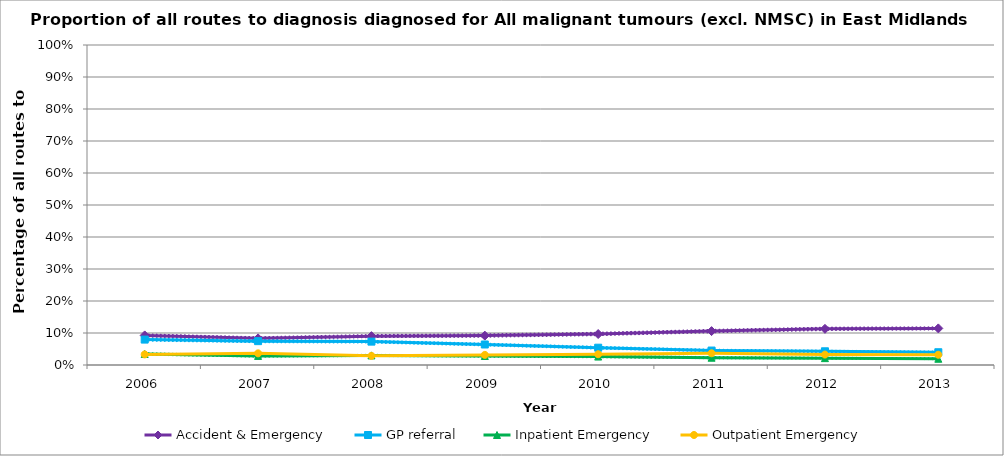
| Category | Accident & Emergency | Series 1 | Series 2 | GP referral | Series 4 | Series 5 | Inpatient Emergency | Series 7 | Series 8 | Outpatient Emergency | Series 10 | Series 11 |
|---|---|---|---|---|---|---|---|---|---|---|---|---|
| 2006.0 | 0.092 | 0.089 | 0.096 | 0.079 | 0.076 | 0.083 | 0.034 | 0.032 | 0.037 | 0.033 |  |  |
| 2007.0 | 0.083 | 0.08 | 0.087 | 0.075 | 0.071 | 0.078 | 0.028 | 0.026 | 0.03 | 0.036 |  |  |
| 2008.0 | 0.09 | 0.087 | 0.094 | 0.073 | 0.07 | 0.076 | 0.03 | 0.028 | 0.032 | 0.029 |  |  |
| 2009.0 | 0.092 | 0.088 | 0.096 | 0.064 | 0.061 | 0.067 | 0.028 | 0.026 | 0.03 | 0.032 |  |  |
| 2010.0 | 0.097 | 0.093 | 0.101 | 0.054 | 0.051 | 0.057 | 0.026 | 0.024 | 0.028 | 0.034 |  |  |
| 2011.0 | 0.106 | 0.102 | 0.11 | 0.045 | 0.043 | 0.048 | 0.023 | 0.021 | 0.025 | 0.037 |  |  |
| 2012.0 | 0.113 | 0.109 | 0.117 | 0.043 | 0.04 | 0.045 | 0.021 | 0.02 | 0.023 | 0.033 |  |  |
| 2013.0 | 0.114 | 0.111 | 0.118 | 0.04 | 0.038 | 0.042 | 0.02 | 0.018 | 0.021 | 0.032 |  |  |